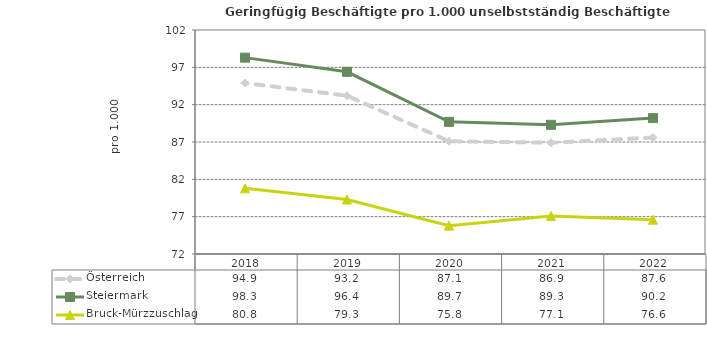
| Category | Österreich | Steiermark | Bruck-Mürzzuschlag |
|---|---|---|---|
| 2022.0 | 87.6 | 90.2 | 76.6 |
| 2021.0 | 86.9 | 89.3 | 77.1 |
| 2020.0 | 87.1 | 89.7 | 75.8 |
| 2019.0 | 93.2 | 96.4 | 79.3 |
| 2018.0 | 94.9 | 98.3 | 80.8 |